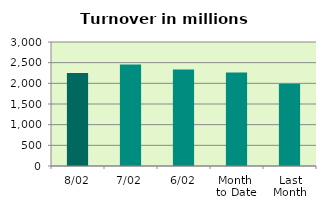
| Category | Series 0 |
|---|---|
| 8/02 | 2250.441 |
| 7/02 | 2456.151 |
| 6/02 | 2337.592 |
| Month 
to Date | 2261.692 |
| Last
Month | 1988.014 |